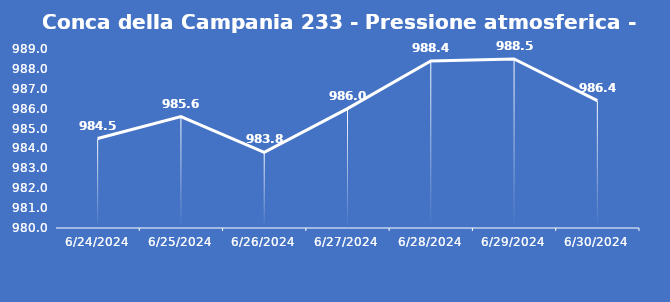
| Category | Conca della Campania 233 - Pressione atmosferica - Grezzo (hPa) |
|---|---|
| 6/24/24 | 984.5 |
| 6/25/24 | 985.6 |
| 6/26/24 | 983.8 |
| 6/27/24 | 986 |
| 6/28/24 | 988.4 |
| 6/29/24 | 988.5 |
| 6/30/24 | 986.4 |